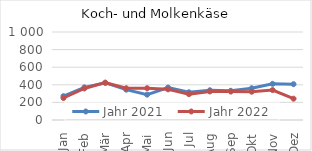
| Category | Jahr 2021 | Jahr 2022 |
|---|---|---|
| Jan | 271.48 | 249.935 |
| Feb | 371.145 | 358.591 |
| Mär | 422.484 | 424.52 |
| Apr | 344.775 | 360.578 |
| Mai | 288.083 | 361.282 |
| Jun | 369.138 | 348.345 |
| Jul | 315.035 | 294.034 |
| Aug | 337.838 | 324.295 |
| Sep | 332.002 | 323.227 |
| Okt | 360.792 | 321.1 |
| Nov | 411.015 | 340.214 |
| Dez | 407.026 | 242.398 |